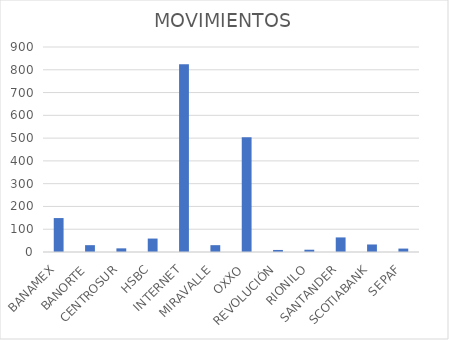
| Category | MOVIMIENTOS |
|---|---|
| BANAMEX | 149 |
| BANORTE | 30 |
| CENTROSUR | 16 |
| HSBC | 59 |
| INTERNET | 824 |
| MIRAVALLE | 30 |
| OXXO | 504 |
| REVOLUCIÓN | 9 |
| RIONILO | 10 |
| SANTANDER | 64 |
| SCOTIABANK | 33 |
| SEPAF | 15 |